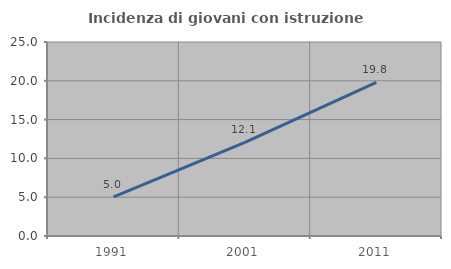
| Category | Incidenza di giovani con istruzione universitaria |
|---|---|
| 1991.0 | 5.031 |
| 2001.0 | 12.073 |
| 2011.0 | 19.797 |